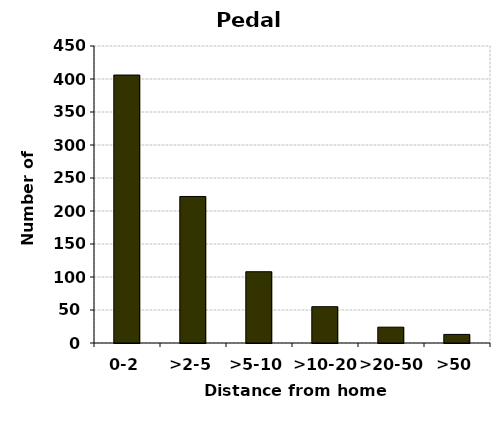
| Category | Pedal cycles |
|---|---|
| 0-2 | 406 |
| >2-5 | 222 |
| >5-10 | 108 |
| >10-20 | 55 |
| >20-50 | 24 |
| >50 | 13 |